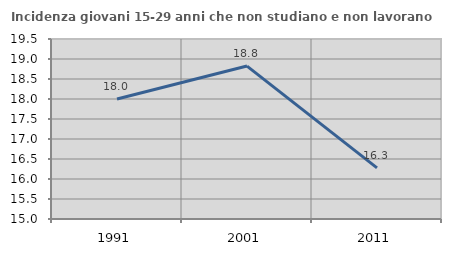
| Category | Incidenza giovani 15-29 anni che non studiano e non lavorano  |
|---|---|
| 1991.0 | 18 |
| 2001.0 | 18.824 |
| 2011.0 | 16.279 |